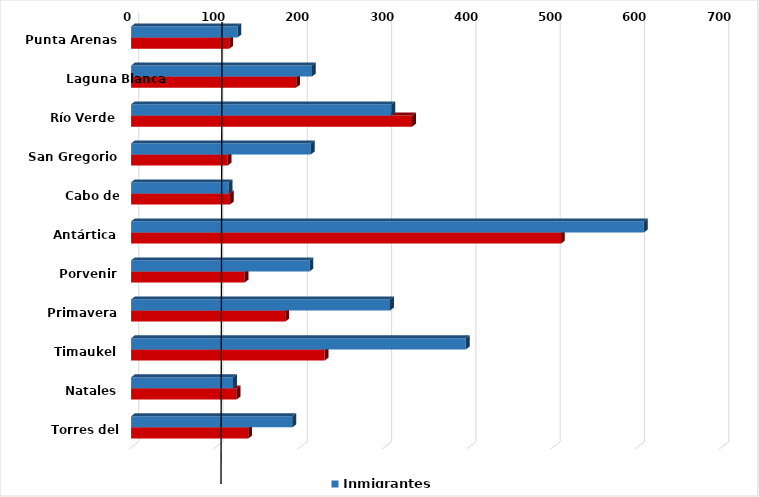
| Category | Inmigrantes | Emigrantes |
|---|---|---|
| Punta Arenas | 126.141 | 116.467 |
| Laguna Blanca | 214.634 | 195.833 |
| Río Verde | 308.696 | 333.333 |
| San Gregorio | 213.208 | 114.458 |
| Cabo de Hornos | 115.859 | 117.143 |
| Antártica | 608.333 | 510 |
| Porvenir | 211.672 | 134.649 |
| Primavera | 307.273 | 182.895 |
| Timaukel | 397.143 | 229.63 |
| Natales | 120.991 | 125.157 |
| Torres del Paine | 191.304 | 138.983 |